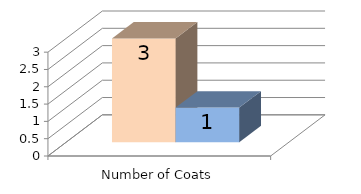
| Category | Competitive Systems | JFB Hart Systems |
|---|---|---|
| Number of Coats | 3 | 1 |